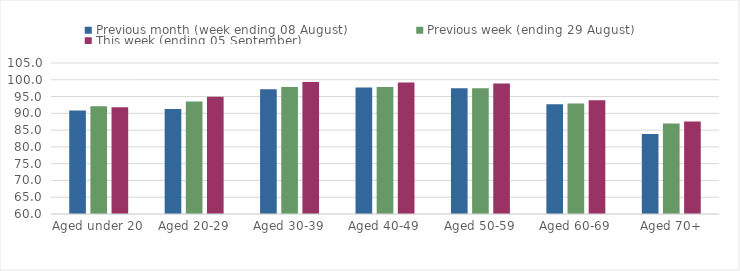
| Category | Previous month (week ending 08 August) | Previous week (ending 29 August) | This week (ending 05 September) |
|---|---|---|---|
| Aged under 20 | 90.83 | 92.09 | 91.78 |
| Aged 20-29 | 91.31 | 93.49 | 94.92 |
| Aged 30-39 | 97.17 | 97.86 | 99.34 |
| Aged 40-49 | 97.73 | 97.83 | 99.16 |
| Aged 50-59 | 97.51 | 97.44 | 98.91 |
| Aged 60-69 | 92.73 | 92.9 | 93.91 |
| Aged 70+ | 83.87 | 86.97 | 87.58 |